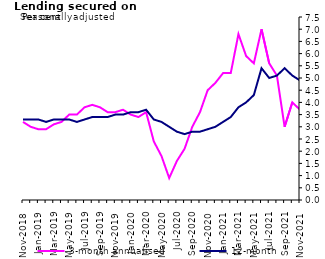
| Category | 3-month annualised | 12-month |
|---|---|---|
| Nov-2018 | 3.2 | 3.3 |
| Dec-2018 | 3 | 3.3 |
| Jan-2019 | 2.9 | 3.3 |
| Feb-2019 | 2.9 | 3.2 |
| Mar-2019 | 3.1 | 3.3 |
| Apr-2019 | 3.2 | 3.3 |
| May-2019 | 3.5 | 3.3 |
| Jun-2019 | 3.5 | 3.2 |
| Jul-2019 | 3.8 | 3.3 |
| Aug-2019 | 3.9 | 3.4 |
| Sep-2019 | 3.8 | 3.4 |
| Oct-2019 | 3.6 | 3.4 |
| Nov-2019 | 3.6 | 3.5 |
| Dec-2019 | 3.7 | 3.5 |
| Jan-2020 | 3.5 | 3.6 |
| Feb-2020 | 3.4 | 3.6 |
| Mar-2020 | 3.6 | 3.7 |
| Apr-2020 | 2.4 | 3.3 |
| May-2020 | 1.8 | 3.2 |
| Jun-2020 | 0.9 | 3 |
| Jul-2020 | 1.6 | 2.8 |
| Aug-2020 | 2.1 | 2.7 |
| Sep-2020 | 3 | 2.8 |
| Oct-2020 | 3.6 | 2.8 |
| Nov-2020 | 4.5 | 2.9 |
| Dec-2020 | 4.8 | 3 |
| Jan-2021 | 5.2 | 3.2 |
| Feb-2021 | 5.2 | 3.4 |
| Mar-2021 | 6.8 | 3.8 |
| Apr-2021 | 5.9 | 4 |
| May-2021 | 5.6 | 4.3 |
| Jun-2021 | 7 | 5.4 |
| Jul-2021 | 5.6 | 5 |
| Aug-2021 | 5.1 | 5.1 |
| Sep-2021 | 3 | 5.4 |
| Oct-2021 | 4 | 5.1 |
| Nov-2021 | 3.7 | 4.9 |